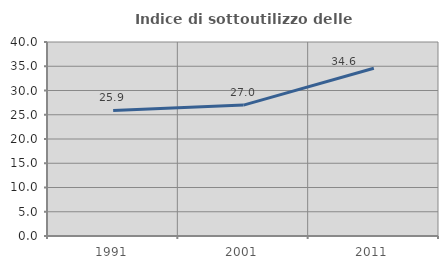
| Category | Indice di sottoutilizzo delle abitazioni  |
|---|---|
| 1991.0 | 25.889 |
| 2001.0 | 26.989 |
| 2011.0 | 34.584 |